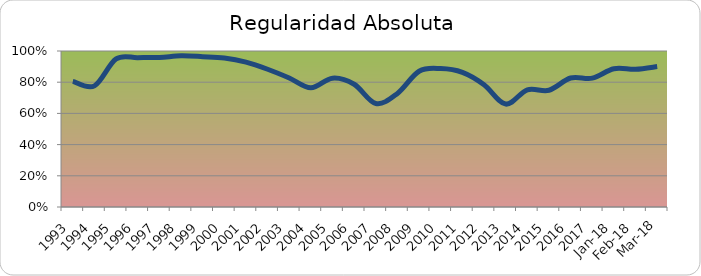
| Category | Series 0 |
|---|---|
| 1993.0 | 0.805 |
| 1994.0 | 0.776 |
| 1995.0 | 0.949 |
| 1996.0 | 0.958 |
| 1997.0 | 0.958 |
| 1998.0 | 0.969 |
| 1999.0 | 0.964 |
| 2000.0 | 0.955 |
| 2001.0 | 0.929 |
| 2002.0 | 0.883 |
| 2003.0 | 0.827 |
| 2004.0 | 0.764 |
| 2005.0 | 0.826 |
| 2006.0 | 0.787 |
| 2007.0 | 0.664 |
| 2008.0 | 0.728 |
| 2009.0 | 0.87 |
| 2010.0 | 0.887 |
| 2011.0 | 0.863 |
| 2012.0 | 0.783 |
| 2013.0 | 0.66 |
| 2014.0 | 0.751 |
| 2015.0 | 0.749 |
| 2016.0 | 0.827 |
| 2017.0 | 0.826 |
| 43101.0 | 0.886 |
| 43132.0 | 0.883 |
| 43160.0 | 0.9 |